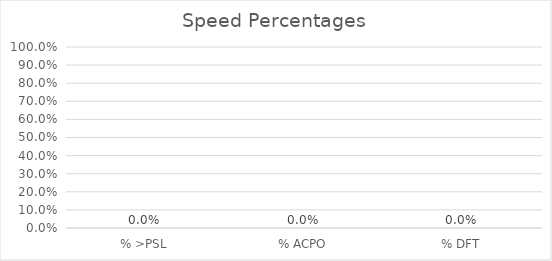
| Category | Series 0 |
|---|---|
| % >PSL | 0 |
| % ACPO | 0 |
| % DFT | 0 |